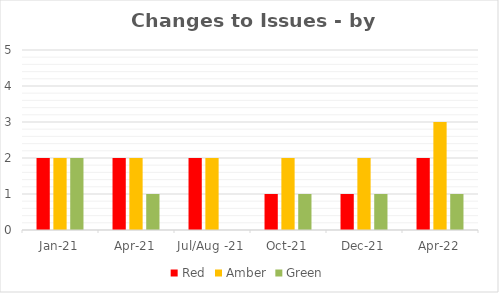
| Category | Red | Amber | Green |
|---|---|---|---|
| Jan-21 | 2 | 2 | 2 |
| Apr-21 | 2 | 2 | 1 |
| Jul/Aug -21 | 2 | 2 | 0 |
| Oct-21 | 1 | 2 | 1 |
| Dec-21 | 1 | 2 | 1 |
| Apr-22 | 2 | 3 | 1 |